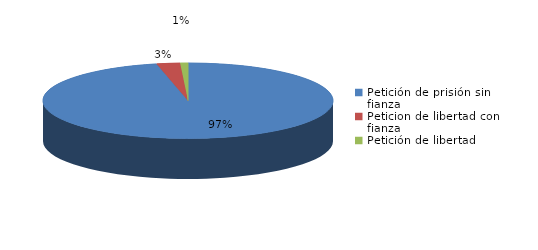
| Category | Series 0 |
|---|---|
| Petición de prisión sin fianza | 111 |
| Peticion de libertad con fianza | 3 |
| Petición de libertad | 1 |